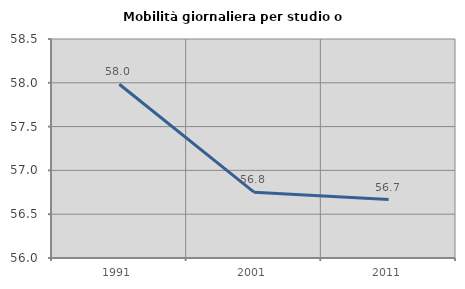
| Category | Mobilità giornaliera per studio o lavoro |
|---|---|
| 1991.0 | 57.984 |
| 2001.0 | 56.752 |
| 2011.0 | 56.667 |